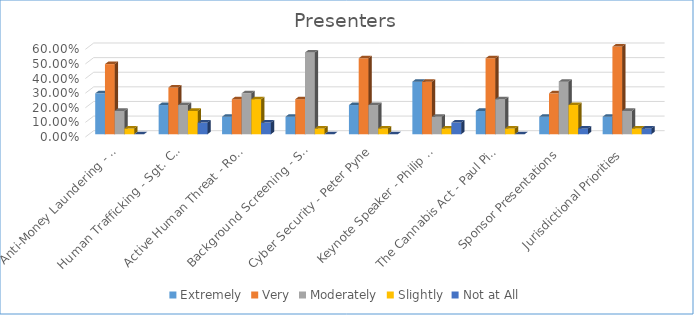
| Category | Extremely | Very | Moderately | Slightly | Not at All |
|---|---|---|---|---|---|
| Anti-Money Laundering - Rob Kroeker | 0.28 | 0.48 | 0.16 | 0.04 | 0 |
| Human Trafficking - Sgt. Chris Lemaich | 0.2 | 0.32 | 0.2 | 0.16 | 0.08 |
| Active Human Threat - Rod Buckingham | 0.12 | 0.24 | 0.28 | 0.24 | 0.08 |
| Background Screening - Sarah Baldeo | 0.12 | 0.24 | 0.56 | 0.04 | 0 |
| Cyber Security - Peter Pyne | 0.2 | 0.52 | 0.2 | 0.04 | 0 |
| Keynote Speaker - Philip Mudd | 0.36 | 0.36 | 0.12 | 0.04 | 0.08 |
| The Cannabis Act - Paul Pingue | 0.16 | 0.52 | 0.24 | 0.04 | 0 |
| Sponsor Presentations | 0.12 | 0.28 | 0.36 | 0.2 | 0.04 |
| Jurisdictional Priorities | 0.12 | 0.6 | 0.16 | 0.04 | 0.04 |